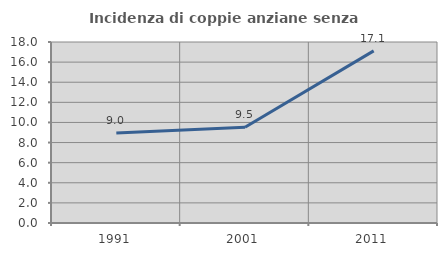
| Category | Incidenza di coppie anziane senza figli  |
|---|---|
| 1991.0 | 8.962 |
| 2001.0 | 9.524 |
| 2011.0 | 17.117 |